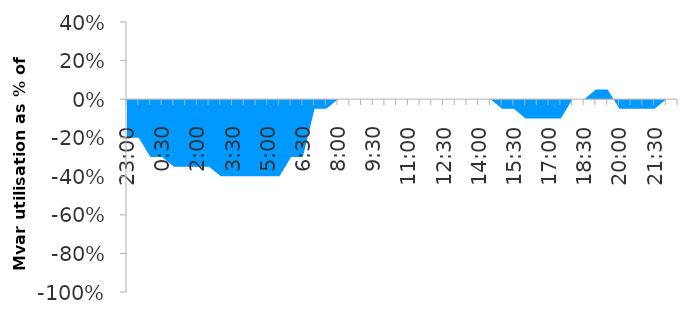
| Category | Series 0 |
|---|---|
| 0.9583333333333334 | -0.2 |
| 0.9791666666666666 | -0.2 |
| 0.0 | -0.3 |
| 0.020833333333333332 | -0.3 |
| 0.041666666666666664 | -0.35 |
| 0.0625 | -0.35 |
| 0.08333333333333333 | -0.35 |
| 0.10416666666666667 | -0.35 |
| 0.125 | -0.4 |
| 0.14583333333333334 | -0.4 |
| 0.16666666666666666 | -0.4 |
| 0.1875 | -0.4 |
| 0.20833333333333334 | -0.4 |
| 0.22916666666666666 | -0.4 |
| 0.25 | -0.3 |
| 0.2708333333333333 | -0.3 |
| 0.2916666666666667 | -0.05 |
| 0.3125 | -0.05 |
| 0.3333333333333333 | 0 |
| 0.3541666666666667 | 0 |
| 0.375 | 0 |
| 0.3958333333333333 | 0 |
| 0.4166666666666667 | 0 |
| 0.4375 | 0 |
| 0.4583333333333333 | 0 |
| 0.4791666666666667 | 0 |
| 0.5 | 0 |
| 0.5208333333333334 | 0 |
| 0.5416666666666666 | 0 |
| 0.5625 | 0 |
| 0.5833333333333334 | 0 |
| 0.6041666666666666 | 0 |
| 0.625 | -0.05 |
| 0.6458333333333334 | -0.05 |
| 0.6666666666666666 | -0.1 |
| 0.6875 | -0.1 |
| 0.7083333333333334 | -0.1 |
| 0.7291666666666666 | -0.1 |
| 0.75 | 0 |
| 0.7708333333333334 | 0 |
| 0.7916666666666666 | 0.05 |
| 0.8125 | 0.05 |
| 0.8333333333333334 | -0.05 |
| 0.8541666666666666 | -0.05 |
| 0.875 | -0.05 |
| 0.8958333333333334 | -0.05 |
| 0.9166666666666666 | 0 |
| 0.9375 | 0 |